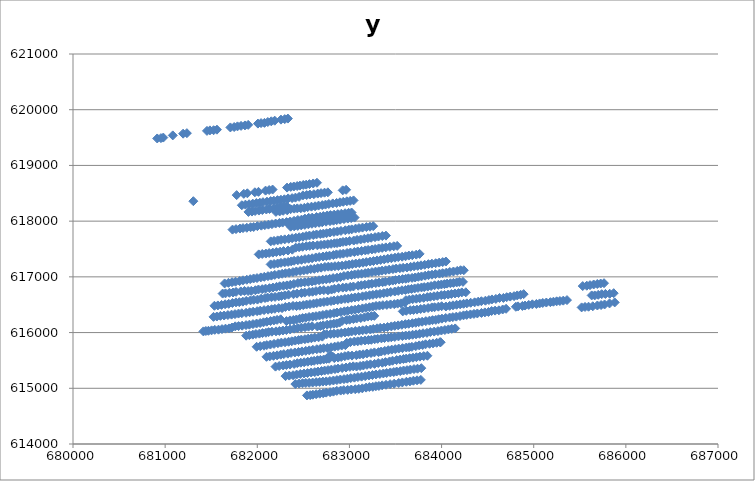
| Category | y |
|---|---|
| 682332.0 | 619841 |
| 682298.0 | 619831 |
| 682257.0 | 619822 |
| 682189.0 | 619803 |
| 682152.0 | 619792 |
| 682114.0 | 619779 |
| 682078.0 | 619764 |
| 682041.0 | 619760 |
| 682007.0 | 619751 |
| 681901.0 | 619728 |
| 681866.0 | 619718 |
| 681824.0 | 619710 |
| 681785.0 | 619701 |
| 681749.0 | 619689 |
| 681708.0 | 619682 |
| 681562.0 | 619642 |
| 681526.0 | 619632 |
| 681486.0 | 619629 |
| 681454.0 | 619620 |
| 681236.0 | 619579 |
| 681195.0 | 619570 |
| 681083.0 | 619539 |
| 680980.0 | 619500 |
| 680954.0 | 619490 |
| 680914.0 | 619484 |
| 682648.0 | 618689 |
| 682607.0 | 618676 |
| 682566.0 | 618665 |
| 682531.0 | 618655 |
| 682499.0 | 618649 |
| 682463.0 | 618638 |
| 682433.0 | 618630 |
| 682396.0 | 618622 |
| 682363.0 | 618615 |
| 682323.0 | 618602 |
| 682166.0 | 618567 |
| 682129.0 | 618558 |
| 682090.0 | 618548 |
| 682013.0 | 618526 |
| 681974.0 | 618518 |
| 681892.0 | 618500 |
| 681854.0 | 618490 |
| 681776.0 | 618467 |
| 681306.0 | 618358 |
| 682964.0 | 618563 |
| 682927.0 | 618553 |
| 682766.0 | 618517 |
| 682730.0 | 618511 |
| 682692.0 | 618503 |
| 682656.0 | 618495 |
| 682614.0 | 618483 |
| 682571.0 | 618477 |
| 682536.0 | 618468 |
| 682496.0 | 618463 |
| 682454.0 | 618436 |
| 682414.0 | 618422 |
| 682378.0 | 618413 |
| 682335.0 | 618408 |
| 682294.0 | 618392 |
| 682257.0 | 618384 |
| 682219.0 | 618377 |
| 682180.0 | 618367 |
| 682145.0 | 618360 |
| 682105.0 | 618349 |
| 682062.0 | 618340 |
| 682028.0 | 618331 |
| 681990.0 | 618324 |
| 681951.0 | 618314 |
| 681911.0 | 618303 |
| 681871.0 | 618296 |
| 681832.0 | 618285 |
| 683045.0 | 618372 |
| 683008.0 | 618364 |
| 682972.0 | 618356 |
| 682933.0 | 618347 |
| 682897.0 | 618338 |
| 682861.0 | 618326 |
| 682819.0 | 618318 |
| 682776.0 | 618308 |
| 682740.0 | 618297 |
| 682705.0 | 618288 |
| 682665.0 | 618279 |
| 682627.0 | 618267 |
| 682588.0 | 618260 |
| 682547.0 | 618251 |
| 682511.0 | 618239 |
| 682472.0 | 618231 |
| 682434.0 | 618229 |
| 682401.0 | 618224 |
| 682325.0 | 618194 |
| 682281.0 | 618186 |
| 682243.0 | 618174 |
| 682202.0 | 618166 |
| 682323.0 | 618263 |
| 682288.0 | 618260 |
| 682251.0 | 618253 |
| 682211.0 | 618237 |
| 682174.0 | 618225 |
| 682133.0 | 618218 |
| 682098.0 | 618209 |
| 682055.0 | 618199 |
| 682017.0 | 618190 |
| 681976.0 | 618182 |
| 681942.0 | 618172 |
| 681904.0 | 618165 |
| 682362.0 | 618215 |
| 682329.0 | 618218 |
| 683023.0 | 618155 |
| 682991.0 | 618149 |
| 682953.0 | 618142 |
| 682912.0 | 618133 |
| 682874.0 | 618125 |
| 682834.0 | 618117 |
| 682794.0 | 618109 |
| 682759.0 | 618102 |
| 682717.0 | 618091 |
| 682682.0 | 618080 |
| 682642.0 | 618074 |
| 682596.0 | 618063 |
| 682558.0 | 618060 |
| 682517.0 | 618045 |
| 682480.0 | 618027 |
| 682440.0 | 618021 |
| 682399.0 | 618006 |
| 682357.0 | 617994 |
| 682317.0 | 617983 |
| 682275.0 | 617974 |
| 682240.0 | 617967 |
| 682199.0 | 617957 |
| 682159.0 | 617946 |
| 682121.0 | 617937 |
| 682082.0 | 617928 |
| 682044.0 | 617919 |
| 682001.0 | 617910 |
| 681961.0 | 617895 |
| 681927.0 | 617891 |
| 681886.0 | 617881 |
| 681845.0 | 617875 |
| 681812.0 | 617867 |
| 681769.0 | 617857 |
| 681731.0 | 617848 |
| 683056.0 | 618064 |
| 683019.0 | 618055 |
| 682982.0 | 618046 |
| 682941.0 | 618036 |
| 682900.0 | 618026 |
| 682862.0 | 618017 |
| 682827.0 | 618008 |
| 682789.0 | 617999 |
| 682746.0 | 617990 |
| 682705.0 | 617980 |
| 682671.0 | 617971 |
| 682631.0 | 617961 |
| 682593.0 | 617953 |
| 682554.0 | 617943 |
| 682516.0 | 617933 |
| 682477.0 | 617924 |
| 682439.0 | 617914 |
| 682400.0 | 617907 |
| 682362.0 | 617901 |
| 683258.0 | 617910 |
| 683223.0 | 617900 |
| 683184.0 | 617893 |
| 683142.0 | 617884 |
| 683103.0 | 617875 |
| 683067.0 | 617866 |
| 683025.0 | 617853 |
| 682994.0 | 617846 |
| 682955.0 | 617836 |
| 682908.0 | 617825 |
| 682869.0 | 617815 |
| 682832.0 | 617806 |
| 682790.0 | 617796 |
| 682752.0 | 617783 |
| 682717.0 | 617776 |
| 682684.0 | 617769 |
| 682643.0 | 617761 |
| 682608.0 | 617751 |
| 682566.0 | 617742 |
| 682531.0 | 617733 |
| 682495.0 | 617720 |
| 682455.0 | 617711 |
| 682418.0 | 617702 |
| 682378.0 | 617694 |
| 682341.0 | 617683 |
| 682298.0 | 617673 |
| 682258.0 | 617666 |
| 682221.0 | 617655 |
| 682182.0 | 617645 |
| 682146.0 | 617637 |
| 683396.0 | 617740 |
| 683357.0 | 617733 |
| 683315.0 | 617723 |
| 683278.0 | 617712 |
| 683236.0 | 617702 |
| 683201.0 | 617693 |
| 683162.0 | 617684 |
| 683122.0 | 617671 |
| 683083.0 | 617664 |
| 683047.0 | 617652 |
| 683002.0 | 617644 |
| 682965.0 | 617633 |
| 682930.0 | 617627 |
| 682899.0 | 617617 |
| 682866.0 | 617606 |
| 682837.0 | 617602 |
| 682801.0 | 617593 |
| 682765.0 | 617586 |
| 682728.0 | 617581 |
| 682691.0 | 617573 |
| 682652.0 | 617566 |
| 682606.0 | 617562 |
| 682569.0 | 617555 |
| 682532.0 | 617550 |
| 682492.0 | 617540 |
| 682454.0 | 617532 |
| 682417.0 | 617524 |
| 682380.0 | 617488 |
| 682333.0 | 617473 |
| 682285.0 | 617463 |
| 682248.0 | 617453 |
| 682207.0 | 617445 |
| 682169.0 | 617435 |
| 682129.0 | 617427 |
| 682093.0 | 617418 |
| 682054.0 | 617411 |
| 682016.0 | 617403 |
| 683518.0 | 617556 |
| 683481.0 | 617549 |
| 683439.0 | 617539 |
| 683395.0 | 617529 |
| 683355.0 | 617520 |
| 683317.0 | 617511 |
| 683279.0 | 617501 |
| 683244.0 | 617492 |
| 683203.0 | 617484 |
| 683172.0 | 617475 |
| 683132.0 | 617466 |
| 683090.0 | 617456 |
| 683054.0 | 617446 |
| 683011.0 | 617437 |
| 682974.0 | 617428 |
| 682934.0 | 617417 |
| 682898.0 | 617410 |
| 682859.0 | 617403 |
| 682826.0 | 617391 |
| 682784.0 | 617381 |
| 682750.0 | 617373 |
| 682714.0 | 617365 |
| 682672.0 | 617356 |
| 682635.0 | 617348 |
| 682595.0 | 617334 |
| 682557.0 | 617326 |
| 682518.0 | 617318 |
| 682480.0 | 617306 |
| 682440.0 | 617298 |
| 682399.0 | 617289 |
| 682368.0 | 617278 |
| 682335.0 | 617268 |
| 682297.0 | 617260 |
| 682257.0 | 617252 |
| 682221.0 | 617240 |
| 682182.0 | 617231 |
| 682145.0 | 617224 |
| 683762.0 | 617412 |
| 683725.0 | 617399 |
| 683682.0 | 617388 |
| 683645.0 | 617382 |
| 683609.0 | 617370 |
| 683572.0 | 617362 |
| 683530.0 | 617354 |
| 683494.0 | 617344 |
| 683455.0 | 617334 |
| 683416.0 | 617326 |
| 683377.0 | 617314 |
| 683339.0 | 617304 |
| 683300.0 | 617295 |
| 683261.0 | 617284 |
| 683225.0 | 617275 |
| 683183.0 | 617265 |
| 683147.0 | 617254 |
| 683108.0 | 617245 |
| 683069.0 | 617239 |
| 683031.0 | 617229 |
| 682996.0 | 617219 |
| 682960.0 | 617211 |
| 682920.0 | 617201 |
| 682880.0 | 617195 |
| 682843.0 | 617191 |
| 682805.0 | 617184 |
| 682771.0 | 617183 |
| 682734.0 | 617178 |
| 682693.0 | 617165 |
| 682656.0 | 617156 |
| 682619.0 | 617144 |
| 682580.0 | 617138 |
| 682542.0 | 617125 |
| 682504.0 | 617115 |
| 682465.0 | 617105 |
| 682424.0 | 617097 |
| 682387.0 | 617085 |
| 682345.0 | 617074 |
| 682306.0 | 617065 |
| 682270.0 | 617056 |
| 682232.0 | 617044 |
| 682190.0 | 617035 |
| 682153.0 | 617022 |
| 682116.0 | 617012 |
| 682076.0 | 617001 |
| 682038.0 | 616990 |
| 681997.0 | 616978 |
| 681960.0 | 616971 |
| 681923.0 | 616959 |
| 681886.0 | 616948 |
| 681845.0 | 616938 |
| 681808.0 | 616924 |
| 681764.0 | 616913 |
| 681726.0 | 616904 |
| 681687.0 | 616893 |
| 681646.0 | 616882 |
| 684047.0 | 617275 |
| 684012.0 | 617265 |
| 683974.0 | 617256 |
| 683936.0 | 617245 |
| 683895.0 | 617237 |
| 683857.0 | 617228 |
| 683817.0 | 617217 |
| 683777.0 | 617207 |
| 683741.0 | 617197 |
| 683701.0 | 617190 |
| 683664.0 | 617180 |
| 683624.0 | 617168 |
| 683583.0 | 617163 |
| 683547.0 | 617155 |
| 683507.0 | 617149 |
| 683472.0 | 617139 |
| 683431.0 | 617130 |
| 683392.0 | 617118 |
| 683354.0 | 617112 |
| 683318.0 | 617100 |
| 683283.0 | 617095 |
| 683244.0 | 617085 |
| 683204.0 | 617075 |
| 683171.0 | 617066 |
| 683132.0 | 617057 |
| 683094.0 | 617051 |
| 683057.0 | 617043 |
| 683023.0 | 617033 |
| 682982.0 | 617025 |
| 682940.0 | 617015 |
| 682902.0 | 616996 |
| 682865.0 | 616985 |
| 682823.0 | 616978 |
| 682786.0 | 616965 |
| 682749.0 | 616956 |
| 682710.0 | 616949 |
| 682670.0 | 616939 |
| 682630.0 | 616930 |
| 682594.0 | 616918 |
| 682554.0 | 616910 |
| 682515.0 | 616903 |
| 682474.0 | 616895 |
| 682441.0 | 616889 |
| 682397.0 | 616873 |
| 682358.0 | 616858 |
| 682321.0 | 616847 |
| 682284.0 | 616841 |
| 682243.0 | 616831 |
| 682209.0 | 616821 |
| 682170.0 | 616808 |
| 682132.0 | 616797 |
| 682090.0 | 616789 |
| 682053.0 | 616779 |
| 682013.0 | 616773 |
| 681979.0 | 616760 |
| 681935.0 | 616749 |
| 681900.0 | 616745 |
| 681861.0 | 616747 |
| 681821.0 | 616739 |
| 681770.0 | 616730 |
| 681737.0 | 616719 |
| 681698.0 | 616714 |
| 681655.0 | 616704 |
| 681624.0 | 616700 |
| 684241.0 | 617119 |
| 684206.0 | 617119 |
| 684170.0 | 617107 |
| 684129.0 | 617096 |
| 684089.0 | 617088 |
| 684052.0 | 617076 |
| 684011.0 | 617066 |
| 683977.0 | 617058 |
| 683933.0 | 617049 |
| 683896.0 | 617039 |
| 683858.0 | 617030 |
| 683822.0 | 617021 |
| 683782.0 | 617008 |
| 683748.0 | 617001 |
| 683713.0 | 616989 |
| 683680.0 | 616982 |
| 683640.0 | 616974 |
| 683611.0 | 616966 |
| 683576.0 | 616960 |
| 683539.0 | 616952 |
| 683500.0 | 616942 |
| 683470.0 | 616933 |
| 683433.0 | 616922 |
| 683390.0 | 616913 |
| 683360.0 | 616904 |
| 683321.0 | 616897 |
| 683286.0 | 616888 |
| 683243.0 | 616877 |
| 683208.0 | 616868 |
| 683167.0 | 616859 |
| 683129.0 | 616849 |
| 683095.0 | 616841 |
| 683043.0 | 616827 |
| 683009.0 | 616821 |
| 682966.0 | 616810 |
| 682928.0 | 616807 |
| 682882.0 | 616797 |
| 682837.0 | 616785 |
| 682806.0 | 616772 |
| 682767.0 | 616758 |
| 682722.0 | 616761 |
| 682680.0 | 616757 |
| 682637.0 | 616744 |
| 682600.0 | 616733 |
| 682563.0 | 616727 |
| 682515.0 | 616718 |
| 682479.0 | 616710 |
| 682432.0 | 616699 |
| 682393.0 | 616688 |
| 682339.0 | 616680 |
| 682299.0 | 616667 |
| 682263.0 | 616656 |
| 682233.0 | 616649 |
| 682193.0 | 616640 |
| 682154.0 | 616635 |
| 682112.0 | 616628 |
| 682084.0 | 616620 |
| 682042.0 | 616608 |
| 682002.0 | 616592 |
| 681962.0 | 616588 |
| 681926.0 | 616578 |
| 681880.0 | 616568 |
| 681843.0 | 616555 |
| 681805.0 | 616546 |
| 681769.0 | 616542 |
| 681730.0 | 616531 |
| 681690.0 | 616516 |
| 681651.0 | 616508 |
| 681612.0 | 616497 |
| 681572.0 | 616487 |
| 681535.0 | 616481 |
| 684232.0 | 616910 |
| 684193.0 | 616908 |
| 684164.0 | 616900 |
| 684129.0 | 616892 |
| 684096.0 | 616885 |
| 684060.0 | 616879 |
| 684031.0 | 616869 |
| 683998.0 | 616863 |
| 683965.0 | 616856 |
| 683924.0 | 616849 |
| 683886.0 | 616835 |
| 683850.0 | 616825 |
| 683812.0 | 616816 |
| 683782.0 | 616810 |
| 683744.0 | 616801 |
| 683708.0 | 616792 |
| 683674.0 | 616783 |
| 683640.0 | 616776 |
| 683608.0 | 616765 |
| 683570.0 | 616759 |
| 683530.0 | 616748 |
| 683492.0 | 616737 |
| 683448.0 | 616728 |
| 683410.0 | 616717 |
| 683372.0 | 616706 |
| 683332.0 | 616696 |
| 683293.0 | 616688 |
| 683255.0 | 616678 |
| 683218.0 | 616670 |
| 683180.0 | 616660 |
| 683142.0 | 616650 |
| 683097.0 | 616640 |
| 683059.0 | 616630 |
| 683022.0 | 616623 |
| 682986.0 | 616609 |
| 682951.0 | 616605 |
| 682912.0 | 616594 |
| 682873.0 | 616584 |
| 682832.0 | 616576 |
| 682800.0 | 616566 |
| 682760.0 | 616557 |
| 682723.0 | 616548 |
| 682685.0 | 616540 |
| 682646.0 | 616529 |
| 682611.0 | 616520 |
| 682572.0 | 616510 |
| 682535.0 | 616503 |
| 682499.0 | 616492 |
| 682461.0 | 616482 |
| 682426.0 | 616476 |
| 682388.0 | 616479 |
| 682346.0 | 616468 |
| 682305.0 | 616459 |
| 682269.0 | 616439 |
| 682232.0 | 616439 |
| 682191.0 | 616427 |
| 682155.0 | 616419 |
| 682117.0 | 616411 |
| 682074.0 | 616403 |
| 682032.0 | 616393 |
| 681998.0 | 616384 |
| 681955.0 | 616375 |
| 681917.0 | 616365 |
| 681878.0 | 616355 |
| 681832.0 | 616347 |
| 681796.0 | 616341 |
| 681758.0 | 616331 |
| 681721.0 | 616322 |
| 681681.0 | 616314 |
| 681640.0 | 616306 |
| 681600.0 | 616300 |
| 681561.0 | 616288 |
| 681525.0 | 616282 |
| 684263.0 | 616723 |
| 684220.0 | 616721 |
| 684184.0 | 616709 |
| 684146.0 | 616702 |
| 684107.0 | 616693 |
| 684072.0 | 616683 |
| 684032.0 | 616676 |
| 683997.0 | 616671 |
| 683955.0 | 616660 |
| 683917.0 | 616651 |
| 683878.0 | 616643 |
| 683845.0 | 616636 |
| 683806.0 | 616623 |
| 683763.0 | 616615 |
| 683726.0 | 616608 |
| 683687.0 | 616599 |
| 683650.0 | 616591 |
| 683613.0 | 616581 |
| 683602.0 | 616535 |
| 683559.0 | 616525 |
| 683523.0 | 616520 |
| 683487.0 | 616510 |
| 683446.0 | 616505 |
| 683406.0 | 616497 |
| 683363.0 | 616492 |
| 683326.0 | 616484 |
| 683289.0 | 616478 |
| 683253.0 | 616467 |
| 683217.0 | 616455 |
| 683179.0 | 616444 |
| 683141.0 | 616434 |
| 683099.0 | 616423 |
| 683061.0 | 616410 |
| 683023.0 | 616402 |
| 682981.0 | 616390 |
| 682945.0 | 616381 |
| 682906.0 | 616369 |
| 682865.0 | 616360 |
| 682832.0 | 616348 |
| 682791.0 | 616336 |
| 682751.0 | 616328 |
| 682712.0 | 616316 |
| 682675.0 | 616306 |
| 682637.0 | 616294 |
| 682602.0 | 616288 |
| 682562.0 | 616280 |
| 682526.0 | 616267 |
| 682492.0 | 616260 |
| 682460.0 | 616249 |
| 682424.0 | 616235 |
| 682391.0 | 616226 |
| 682355.0 | 616219 |
| 682316.0 | 616206 |
| 682254.0 | 616238 |
| 682215.0 | 616228 |
| 682180.0 | 616218 |
| 682144.0 | 616207 |
| 682103.0 | 616195 |
| 682067.0 | 616184 |
| 682031.0 | 616171 |
| 681992.0 | 616162 |
| 681953.0 | 616152 |
| 681914.0 | 616142 |
| 681878.0 | 616134 |
| 681836.0 | 616124 |
| 681797.0 | 616116 |
| 681761.0 | 616112 |
| 681725.0 | 616091 |
| 681693.0 | 616075 |
| 681655.0 | 616070 |
| 681617.0 | 616062 |
| 681579.0 | 616052 |
| 681539.0 | 616049 |
| 681504.0 | 616040 |
| 681470.0 | 616032 |
| 681442.0 | 616029 |
| 681415.0 | 616021 |
| 685763.0 | 616886 |
| 685727.0 | 616880 |
| 685690.0 | 616872 |
| 685651.0 | 616863 |
| 685611.0 | 616851 |
| 685576.0 | 616841 |
| 685532.0 | 616835 |
| 684891.0 | 616690 |
| 684858.0 | 616678 |
| 684821.0 | 616667 |
| 684787.0 | 616654 |
| 684745.0 | 616646 |
| 684707.0 | 616635 |
| 684671.0 | 616622 |
| 684629.0 | 616621 |
| 684589.0 | 616604 |
| 684547.0 | 616595 |
| 684514.0 | 616584 |
| 684476.0 | 616572 |
| 684432.0 | 616563 |
| 684398.0 | 616555 |
| 684359.0 | 616543 |
| 684316.0 | 616535 |
| 684274.0 | 616524 |
| 684239.0 | 616516 |
| 684202.0 | 616507 |
| 684163.0 | 616499 |
| 684124.0 | 616489 |
| 684088.0 | 616479 |
| 684047.0 | 616468 |
| 684001.0 | 616473 |
| 683965.0 | 616465 |
| 683924.0 | 616455 |
| 683894.0 | 616452 |
| 683854.0 | 616441 |
| 683812.0 | 616431 |
| 683773.0 | 616423 |
| 683733.0 | 616412 |
| 683696.0 | 616406 |
| 683660.0 | 616401 |
| 683617.0 | 616391 |
| 683579.0 | 616380 |
| 683270.0 | 616300 |
| 683238.0 | 616295 |
| 683200.0 | 616287 |
| 683163.0 | 616273 |
| 683123.0 | 616261 |
| 683078.0 | 616252 |
| 683043.0 | 616242 |
| 683002.0 | 616231 |
| 682968.0 | 616223 |
| 682921.0 | 616210 |
| 682894.0 | 616180 |
| 682862.0 | 616164 |
| 682831.0 | 616159 |
| 682795.0 | 616149 |
| 682758.0 | 616142 |
| 682715.0 | 616130 |
| 682686.0 | 616118 |
| 682652.0 | 616110 |
| 682595.0 | 616113 |
| 682556.0 | 616106 |
| 682518.0 | 616096 |
| 682478.0 | 616088 |
| 682438.0 | 616080 |
| 682400.0 | 616070 |
| 682357.0 | 616056 |
| 682316.0 | 616044 |
| 682278.0 | 616037 |
| 682240.0 | 616029 |
| 682203.0 | 616022 |
| 682159.0 | 616016 |
| 682123.0 | 616008 |
| 682094.0 | 615997 |
| 682057.0 | 615991 |
| 682023.0 | 615981 |
| 681985.0 | 615974 |
| 681951.0 | 615963 |
| 681914.0 | 615954 |
| 681879.0 | 615944 |
| 685868.0 | 616707 |
| 685825.0 | 616697 |
| 685778.0 | 616693 |
| 685738.0 | 616689 |
| 685700.0 | 616678 |
| 685662.0 | 616667 |
| 685629.0 | 616667 |
| 685361.0 | 616583 |
| 685321.0 | 616573 |
| 685284.0 | 616566 |
| 685249.0 | 616561 |
| 685214.0 | 616554 |
| 685181.0 | 616546 |
| 685137.0 | 616539 |
| 685098.0 | 616531 |
| 685064.0 | 616523 |
| 685029.0 | 616513 |
| 684985.0 | 616507 |
| 684946.0 | 616496 |
| 684906.0 | 616485 |
| 684877.0 | 616478 |
| 684830.0 | 616470 |
| 684806.0 | 616463 |
| 684700.0 | 616427 |
| 684663.0 | 616414 |
| 684622.0 | 616399 |
| 684581.0 | 616394 |
| 684543.0 | 616387 |
| 684509.0 | 616370 |
| 684470.0 | 616362 |
| 684433.0 | 616352 |
| 684388.0 | 616343 |
| 684351.0 | 616335 |
| 684313.0 | 616326 |
| 684273.0 | 616317 |
| 684238.0 | 616309 |
| 684200.0 | 616297 |
| 684160.0 | 616286 |
| 684122.0 | 616277 |
| 684087.0 | 616270 |
| 684045.0 | 616261 |
| 684004.0 | 616250 |
| 683968.0 | 616240 |
| 683938.0 | 616228 |
| 683902.0 | 616223 |
| 683868.0 | 616214 |
| 683829.0 | 616205 |
| 683789.0 | 616195 |
| 683752.0 | 616186 |
| 683720.0 | 616176 |
| 683683.0 | 616168 |
| 683643.0 | 616158 |
| 683607.0 | 616151 |
| 683569.0 | 616140 |
| 683529.0 | 616129 |
| 683492.0 | 616121 |
| 683455.0 | 616111 |
| 683414.0 | 616100 |
| 683375.0 | 616089 |
| 683334.0 | 616085 |
| 683300.0 | 616076 |
| 683259.0 | 616065 |
| 683227.0 | 616055 |
| 683183.0 | 616050 |
| 683144.0 | 616041 |
| 683106.0 | 616034 |
| 683064.0 | 616027 |
| 683023.0 | 616019 |
| 682989.0 | 616012 |
| 682952.0 | 616002 |
| 682911.0 | 615994 |
| 682872.0 | 615985 |
| 682832.0 | 615980 |
| 682796.0 | 615976 |
| 682753.0 | 615969 |
| 682724.0 | 615967 |
| 682706.0 | 615927 |
| 682665.0 | 615915 |
| 682623.0 | 615910 |
| 682587.0 | 615898 |
| 682552.0 | 615891 |
| 682517.0 | 615881 |
| 682478.0 | 615874 |
| 682448.0 | 615865 |
| 682412.0 | 615856 |
| 682374.0 | 615844 |
| 682340.0 | 615835 |
| 682301.0 | 615826 |
| 682261.0 | 615820 |
| 682224.0 | 615809 |
| 682182.0 | 615797 |
| 682142.0 | 615785 |
| 682103.0 | 615775 |
| 682073.0 | 615764 |
| 682032.0 | 615755 |
| 681993.0 | 615745 |
| 685879.0 | 616541 |
| 685823.0 | 616523 |
| 685769.0 | 616504 |
| 685731.0 | 616494 |
| 685691.0 | 616486 |
| 685641.0 | 616472 |
| 685595.0 | 616464 |
| 685557.0 | 616460 |
| 685520.0 | 616452 |
| 683686.0 | 615961 |
| 683648.0 | 615951 |
| 683611.0 | 615947 |
| 683575.0 | 615938 |
| 683532.0 | 615931 |
| 683492.0 | 615921 |
| 683454.0 | 615916 |
| 683422.0 | 615909 |
| 683381.0 | 615902 |
| 683347.0 | 615896 |
| 683307.0 | 615887 |
| 683274.0 | 615880 |
| 683238.0 | 615870 |
| 683206.0 | 615866 |
| 683169.0 | 615859 |
| 683128.0 | 615853 |
| 683090.0 | 615843 |
| 683053.0 | 615839 |
| 683010.0 | 615828 |
| 682971.0 | 615816 |
| 682956.0 | 615774 |
| 682916.0 | 615767 |
| 682876.0 | 615757 |
| 682840.0 | 615747 |
| 682801.0 | 615736 |
| 682760.0 | 615722 |
| 682720.0 | 615718 |
| 682685.0 | 615710 |
| 682646.0 | 615701 |
| 682603.0 | 615691 |
| 682564.0 | 615681 |
| 682526.0 | 615672 |
| 682485.0 | 615662 |
| 682447.0 | 615652 |
| 682408.0 | 615643 |
| 682366.0 | 615634 |
| 682331.0 | 615622 |
| 682288.0 | 615613 |
| 682254.0 | 615603 |
| 682215.0 | 615591 |
| 682176.0 | 615583 |
| 682135.0 | 615572 |
| 682100.0 | 615565 |
| 684148.0 | 616074 |
| 684111.0 | 616067 |
| 684074.0 | 616057 |
| 684036.0 | 616046 |
| 683998.0 | 616037 |
| 683960.0 | 616026 |
| 683920.0 | 616018 |
| 683878.0 | 616009 |
| 683841.0 | 615995 |
| 683799.0 | 615988 |
| 683761.0 | 615978 |
| 683723.0 | 615968 |
| 683983.0 | 615827 |
| 683947.0 | 615817 |
| 683907.0 | 615806 |
| 683870.0 | 615798 |
| 683826.0 | 615790 |
| 683795.0 | 615777 |
| 683757.0 | 615770 |
| 683720.0 | 615756 |
| 683678.0 | 615744 |
| 683648.0 | 615736 |
| 683617.0 | 615732 |
| 683576.0 | 615720 |
| 683535.0 | 615713 |
| 683497.0 | 615703 |
| 683459.0 | 615694 |
| 683421.0 | 615684 |
| 683384.0 | 615671 |
| 683345.0 | 615660 |
| 683316.0 | 615649 |
| 683271.0 | 615644 |
| 683234.0 | 615633 |
| 683189.0 | 615624 |
| 683148.0 | 615610 |
| 683111.0 | 615606 |
| 683075.0 | 615594 |
| 683028.0 | 615587 |
| 682988.0 | 615587 |
| 682950.0 | 615576 |
| 682911.0 | 615562 |
| 682877.0 | 615551 |
| 682836.0 | 615542 |
| 682816.0 | 615571 |
| 682789.0 | 615592 |
| 682779.0 | 615531 |
| 682751.0 | 615526 |
| 682721.0 | 615517 |
| 682685.0 | 615510 |
| 682653.0 | 615504 |
| 682617.0 | 615493 |
| 682586.0 | 615486 |
| 682548.0 | 615477 |
| 682509.0 | 615467 |
| 682472.0 | 615459 |
| 682434.0 | 615450 |
| 682400.0 | 615437 |
| 682355.0 | 615425 |
| 682316.0 | 615417 |
| 682281.0 | 615410 |
| 682238.0 | 615400 |
| 682198.0 | 615389 |
| 683990.0 | 615826 |
| 683846.0 | 615584 |
| 683806.0 | 615577 |
| 683765.0 | 615568 |
| 683727.0 | 615558 |
| 683690.0 | 615549 |
| 683653.0 | 615541 |
| 683616.0 | 615533 |
| 683586.0 | 615526 |
| 683550.0 | 615515 |
| 683512.0 | 615506 |
| 683468.0 | 615495 |
| 683435.0 | 615482 |
| 683391.0 | 615470 |
| 683357.0 | 615459 |
| 683313.0 | 615453 |
| 683273.0 | 615438 |
| 683228.0 | 615430 |
| 683190.0 | 615421 |
| 683151.0 | 615409 |
| 683116.0 | 615400 |
| 683077.0 | 615391 |
| 683041.0 | 615394 |
| 683005.0 | 615385 |
| 682963.0 | 615373 |
| 682921.0 | 615364 |
| 682876.0 | 615354 |
| 682843.0 | 615345 |
| 682804.0 | 615335 |
| 682768.0 | 615327 |
| 682731.0 | 615318 |
| 682697.0 | 615310 |
| 682659.0 | 615300 |
| 682624.0 | 615290 |
| 682585.0 | 615284 |
| 682545.0 | 615273 |
| 682507.0 | 615266 |
| 682467.0 | 615257 |
| 682427.0 | 615246 |
| 682388.0 | 615234 |
| 682347.0 | 615228 |
| 682307.0 | 615218 |
| 683780.0 | 615361 |
| 683739.0 | 615351 |
| 683701.0 | 615345 |
| 683661.0 | 615335 |
| 683625.0 | 615325 |
| 683587.0 | 615319 |
| 683552.0 | 615308 |
| 683513.0 | 615301 |
| 683481.0 | 615292 |
| 683444.0 | 615285 |
| 683404.0 | 615274 |
| 683368.0 | 615266 |
| 683330.0 | 615257 |
| 683288.0 | 615248 |
| 683250.0 | 615239 |
| 683211.0 | 615229 |
| 683171.0 | 615218 |
| 683132.0 | 615209 |
| 683092.0 | 615201 |
| 683054.0 | 615191 |
| 683014.0 | 615183 |
| 682977.0 | 615172 |
| 682941.0 | 615164 |
| 682901.0 | 615157 |
| 682864.0 | 615147 |
| 682826.0 | 615140 |
| 682787.0 | 615131 |
| 682748.0 | 615124 |
| 682712.0 | 615120 |
| 682677.0 | 615114 |
| 682639.0 | 615110 |
| 682601.0 | 615103 |
| 682563.0 | 615098 |
| 682526.0 | 615095 |
| 682491.0 | 615091 |
| 682454.0 | 615085 |
| 682413.0 | 615076 |
| 683775.0 | 615151 |
| 683734.0 | 615143 |
| 683694.0 | 615136 |
| 683656.0 | 615123 |
| 683618.0 | 615117 |
| 683574.0 | 615105 |
| 683535.0 | 615095 |
| 683486.0 | 615083 |
| 683442.0 | 615074 |
| 683397.0 | 615063 |
| 683355.0 | 615053 |
| 683320.0 | 615042 |
| 683287.0 | 615037 |
| 683254.0 | 615026 |
| 683216.0 | 615022 |
| 683181.0 | 615012 |
| 683140.0 | 614999 |
| 683102.0 | 614990 |
| 683063.0 | 614983 |
| 683020.0 | 614978 |
| 682981.0 | 614971 |
| 682939.0 | 614967 |
| 682905.0 | 614959 |
| 682863.0 | 614954 |
| 682826.0 | 614940 |
| 682790.0 | 614930 |
| 682748.0 | 614922 |
| 682715.0 | 614911 |
| 682678.0 | 614903 |
| 682639.0 | 614894 |
| 682603.0 | 614885 |
| 682574.0 | 614877 |
| 682539.0 | 614872 |